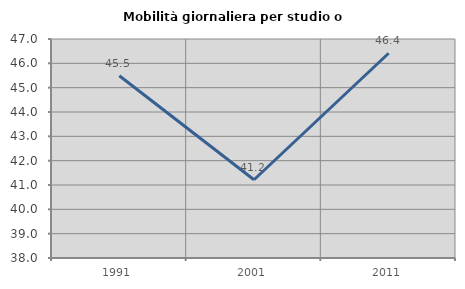
| Category | Mobilità giornaliera per studio o lavoro |
|---|---|
| 1991.0 | 45.488 |
| 2001.0 | 41.215 |
| 2011.0 | 46.416 |